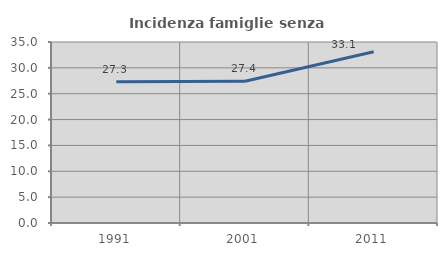
| Category | Incidenza famiglie senza nuclei |
|---|---|
| 1991.0 | 27.326 |
| 2001.0 | 27.41 |
| 2011.0 | 33.119 |